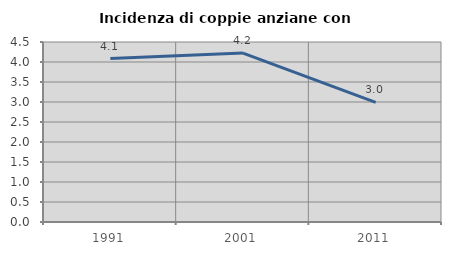
| Category | Incidenza di coppie anziane con figli |
|---|---|
| 1991.0 | 4.086 |
| 2001.0 | 4.223 |
| 2011.0 | 2.991 |